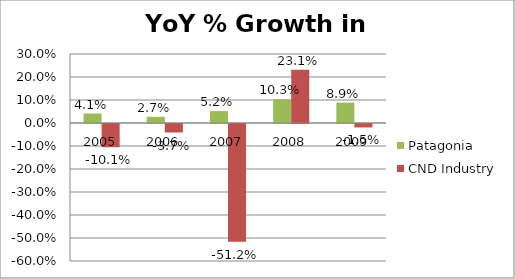
| Category | Patagonia | CND Industry |
|---|---|---|
| 2005.0 | 0.041 | -0.101 |
| 2006.0 | 0.027 | -0.037 |
| 2007.0 | 0.052 | -0.512 |
| 2008.0 | 0.103 | 0.231 |
| 2009.0 | 0.089 | -0.015 |